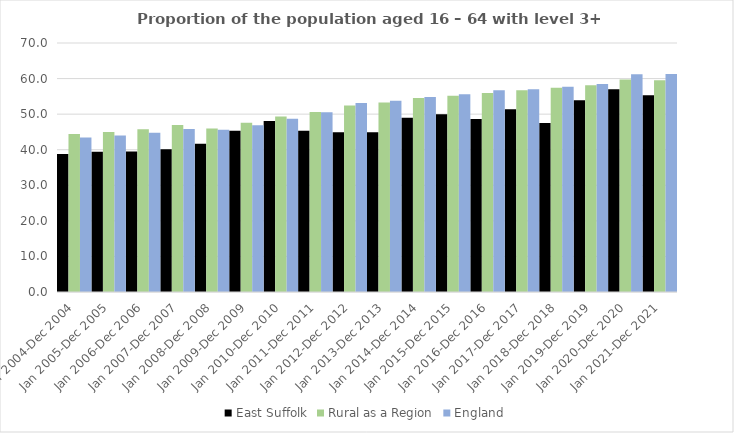
| Category | East Suffolk | Rural as a Region | England |
|---|---|---|---|
| Jan 2004-Dec 2004 | 38.8 | 44.405 | 43.4 |
| Jan 2005-Dec 2005 | 39.4 | 44.973 | 44 |
| Jan 2006-Dec 2006 | 39.5 | 45.774 | 44.8 |
| Jan 2007-Dec 2007 | 40.1 | 46.968 | 45.8 |
| Jan 2008-Dec 2008 | 41.7 | 45.964 | 45.6 |
| Jan 2009-Dec 2009 | 45.3 | 47.59 | 46.9 |
| Jan 2010-Dec 2010 | 48.1 | 49.362 | 48.7 |
| Jan 2011-Dec 2011 | 45.3 | 50.602 | 50.5 |
| Jan 2012-Dec 2012 | 44.9 | 52.439 | 53.1 |
| Jan 2013-Dec 2013 | 44.9 | 53.276 | 53.8 |
| Jan 2014-Dec 2014 | 49 | 54.57 | 54.8 |
| Jan 2015-Dec 2015 | 50 | 55.16 | 55.6 |
| Jan 2016-Dec 2016 | 48.6 | 55.941 | 56.7 |
| Jan 2017-Dec 2017 | 51.4 | 56.689 | 57 |
| Jan 2018-Dec 2018 | 47.5 | 57.389 | 57.7 |
| Jan 2019-Dec 2019 | 53.9 | 58.147 | 58.5 |
| Jan 2020-Dec 2020 | 57 | 59.771 | 61.2 |
| Jan 2021-Dec 2021 | 55.3 | 59.54 | 61.3 |